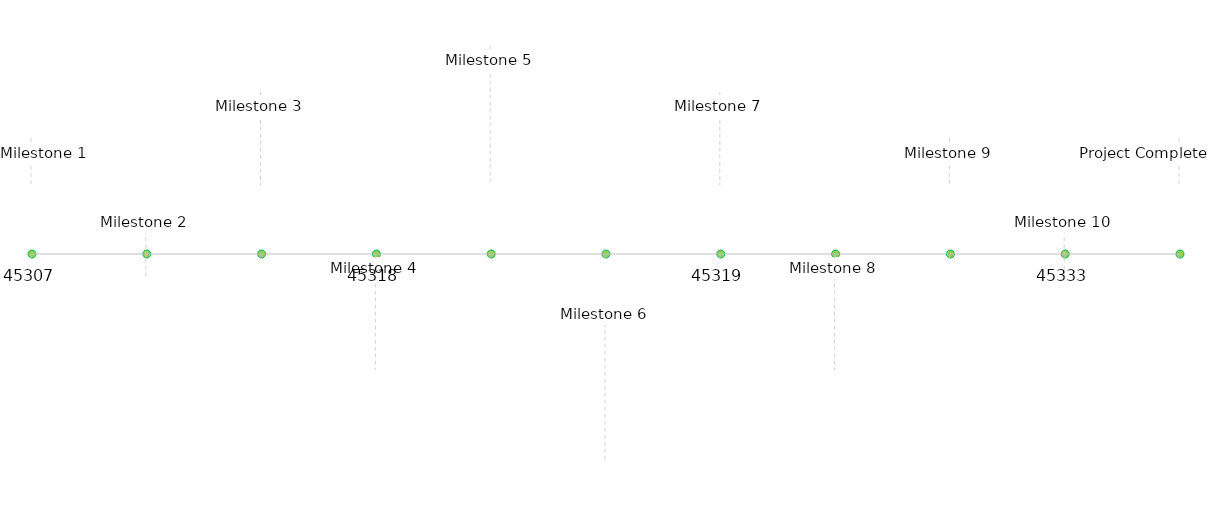
| Category | Series 1 |
|---|---|
| Milestone 1 | 5 |
| Milestone 2 | -5 |
| Milestone 3 | 10 |
| Milestone 4 | -10 |
| Milestone 5 | 15 |
| Milestone 6 | -15 |
| Milestone 7 | 10 |
| Milestone 8 | -10 |
| Milestone 9 | 5 |
| Milestone 10 | -5 |
| Project Complete | 5 |